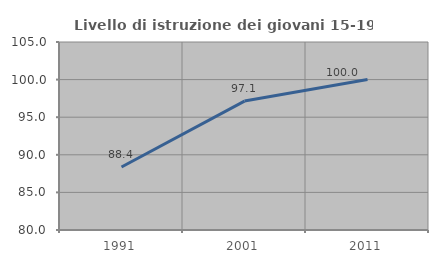
| Category | Livello di istruzione dei giovani 15-19 anni |
|---|---|
| 1991.0 | 88.372 |
| 2001.0 | 97.143 |
| 2011.0 | 100 |